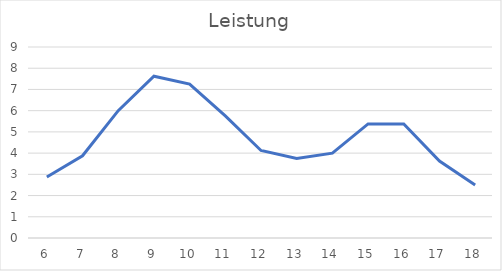
| Category | Series 0 |
|---|---|
| 6.0 | 2.875 |
| 7.0 | 3.875 |
| 8.0 | 6 |
| 9.0 | 7.625 |
| 10.0 | 7.25 |
| 11.0 | 5.75 |
| 12.0 | 4.125 |
| 13.0 | 3.75 |
| 14.0 | 4 |
| 15.0 | 5.375 |
| 16.0 | 5.375 |
| 17.0 | 3.625 |
| 18.0 | 2.5 |